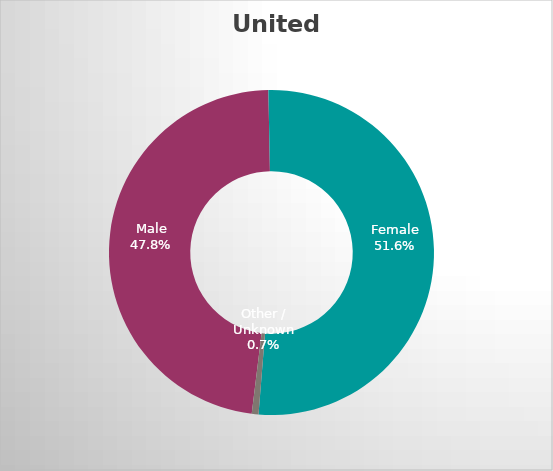
| Category | United States  |
|---|---|
| Male | 0.478 |
| Female | 0.516 |
| Other / Unknown | 0.007 |